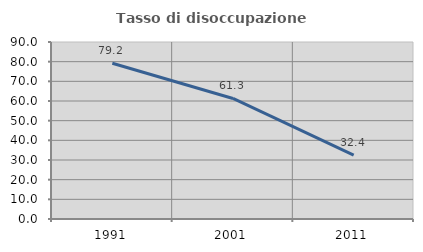
| Category | Tasso di disoccupazione giovanile  |
|---|---|
| 1991.0 | 79.221 |
| 2001.0 | 61.29 |
| 2011.0 | 32.432 |